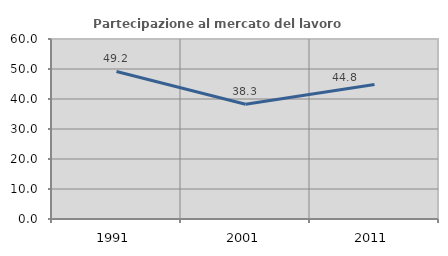
| Category | Partecipazione al mercato del lavoro  femminile |
|---|---|
| 1991.0 | 49.178 |
| 2001.0 | 38.265 |
| 2011.0 | 44.845 |